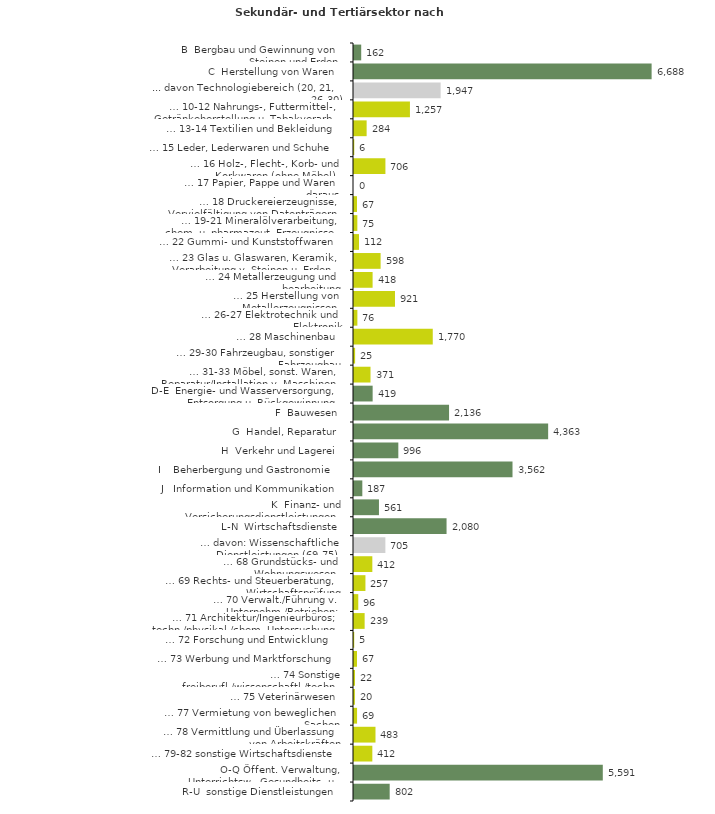
| Category | Series 0 |
|---|---|
| B  Bergbau und Gewinnung von Steinen und Erden | 162 |
| C  Herstellung von Waren | 6688 |
| ... davon Technologiebereich (20, 21, 26-30) | 1947 |
| … 10-12 Nahrungs-, Futtermittel-, Getränkeherstellung u. Tabakverarb. | 1257 |
| … 13-14 Textilien und Bekleidung | 284 |
| … 15 Leder, Lederwaren und Schuhe | 6 |
| … 16 Holz-, Flecht-, Korb- und Korkwaren (ohne Möbel)  | 706 |
| … 17 Papier, Pappe und Waren daraus  | 0 |
| … 18 Druckereierzeugnisse, Vervielfältigung von Datenträgern | 67 |
| … 19-21 Mineralölverarbeitung, chem. u. pharmazeut. Erzeugnisse | 75 |
| … 22 Gummi- und Kunststoffwaren | 112 |
| … 23 Glas u. Glaswaren, Keramik, Verarbeitung v. Steinen u. Erden  | 598 |
| … 24 Metallerzeugung und -bearbeitung | 418 |
| … 25 Herstellung von Metallerzeugnissen  | 921 |
| … 26-27 Elektrotechnik und Elektronik | 76 |
| … 28 Maschinenbau | 1770 |
| … 29-30 Fahrzeugbau, sonstiger Fahrzeugbau | 25 |
| … 31-33 Möbel, sonst. Waren, Reparatur/Installation v. Maschinen | 371 |
| D-E  Energie- und Wasserversorgung, Entsorgung u. Rückgewinnung | 419 |
| F  Bauwesen | 2136 |
| G  Handel, Reparatur | 4363 |
| H  Verkehr und Lagerei | 996 |
| I    Beherbergung und Gastronomie | 3562 |
| J   Information und Kommunikation | 187 |
| K  Finanz- und Versicherungsdienstleistungen | 561 |
| L-N  Wirtschaftsdienste | 2080 |
| … davon: Wissenschaftliche Dienstleistungen (69-75) | 705 |
| … 68 Grundstücks- und Wohnungswesen  | 412 |
| … 69 Rechts- und Steuerberatung, Wirtschaftsprüfung | 257 |
| … 70 Verwalt./Führung v. Unternehm./Betrieben; Unternehmensberat. | 96 |
| … 71 Architektur/Ingenieurbüros; techn./physikal./chem. Untersuchung | 239 |
| … 72 Forschung und Entwicklung  | 5 |
| … 73 Werbung und Marktforschung | 67 |
| … 74 Sonstige freiberufl./wissenschaftl./techn. Tätigkeiten | 22 |
| … 75 Veterinärwesen | 20 |
| … 77 Vermietung von beweglichen Sachen  | 69 |
| … 78 Vermittlung und Überlassung von Arbeitskräften | 483 |
| … 79-82 sonstige Wirtschaftsdienste | 412 |
| O-Q Öffent. Verwaltung, Unterrichtsw., Gesundheits- u. Sozialwesen | 5591 |
| R-U  sonstige Dienstleistungen | 802 |